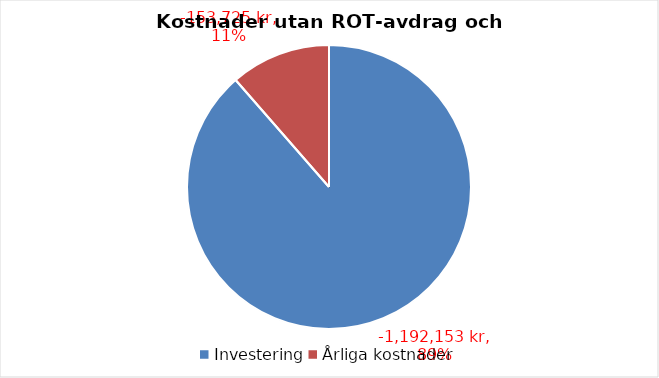
| Category | Series 1 | Series 0 |
|---|---|---|
| Investering | -1192152.565 | -1192152.565 |
| Årliga kostnader | -153724.51 | -153724.51 |